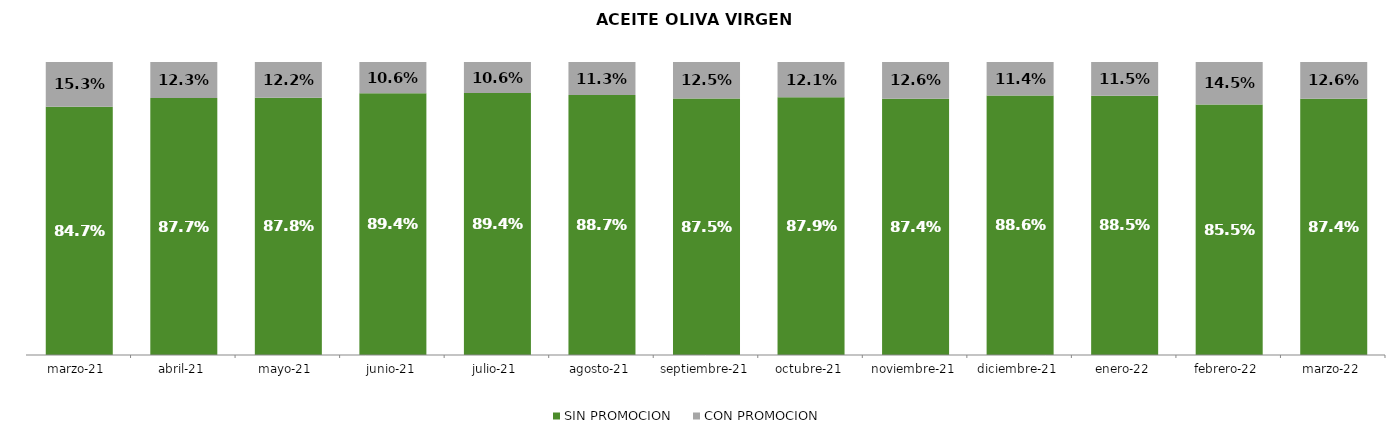
| Category | SIN PROMOCION   | CON PROMOCION   |
|---|---|---|
| 2021-03-01 | 0.847 | 0.153 |
| 2021-04-01 | 0.877 | 0.123 |
| 2021-05-01 | 0.878 | 0.122 |
| 2021-06-01 | 0.894 | 0.106 |
| 2021-07-01 | 0.894 | 0.106 |
| 2021-08-01 | 0.887 | 0.113 |
| 2021-09-01 | 0.875 | 0.125 |
| 2021-10-01 | 0.879 | 0.121 |
| 2021-11-01 | 0.874 | 0.126 |
| 2021-12-01 | 0.886 | 0.114 |
| 2022-01-01 | 0.885 | 0.115 |
| 2022-02-01 | 0.855 | 0.145 |
| 2022-03-01 | 0.874 | 0.126 |